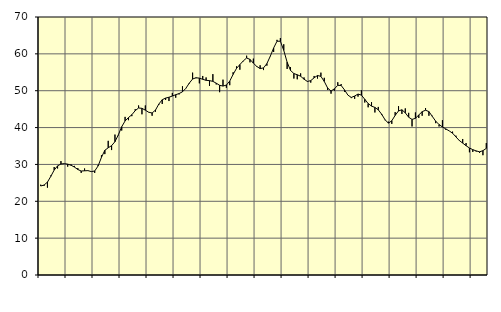
| Category | Piggar | Series 1 |
|---|---|---|
| nan | 24.5 | 24.15 |
| 87.0 | 24.2 | 24.41 |
| 87.0 | 23.7 | 25.2 |
| 87.0 | 27 | 26.77 |
| nan | 29.3 | 28.47 |
| 88.0 | 28.9 | 29.61 |
| 88.0 | 30.9 | 30.12 |
| 88.0 | 30.2 | 30.22 |
| nan | 29.4 | 30.08 |
| 89.0 | 30 | 29.78 |
| 89.0 | 29.6 | 29.28 |
| 89.0 | 29 | 28.62 |
| nan | 27.7 | 28.21 |
| 90.0 | 28.9 | 28.27 |
| 90.0 | 28.3 | 28.32 |
| 90.0 | 28.1 | 28.05 |
| nan | 27.7 | 28.22 |
| 91.0 | 29.8 | 29.57 |
| 91.0 | 32.5 | 31.93 |
| 91.0 | 32.8 | 33.83 |
| nan | 36.4 | 34.52 |
| 92.0 | 33.9 | 35.09 |
| 92.0 | 38.1 | 36.17 |
| 92.0 | 37.9 | 38.03 |
| nan | 39.2 | 40.23 |
| 93.0 | 42.9 | 41.79 |
| 93.0 | 42 | 42.71 |
| 93.0 | 43.1 | 43.48 |
| nan | 45 | 44.59 |
| 94.0 | 46 | 45.31 |
| 94.0 | 43.6 | 45.22 |
| 94.0 | 46 | 44.72 |
| nan | 44.2 | 44.16 |
| 95.0 | 43.2 | 43.96 |
| 95.0 | 44.3 | 44.74 |
| 95.0 | 46.2 | 46.39 |
| nan | 46.4 | 47.55 |
| 96.0 | 47.5 | 48 |
| 96.0 | 47.2 | 48.23 |
| 96.0 | 49.4 | 48.56 |
| nan | 48.1 | 48.92 |
| 97.0 | 49 | 49.23 |
| 97.0 | 51.2 | 49.7 |
| 97.0 | 50.6 | 50.64 |
| nan | 51.9 | 52.04 |
| 98.0 | 54.9 | 53.17 |
| 98.0 | 53.4 | 53.52 |
| 98.0 | 52 | 53.41 |
| nan | 54 | 53.09 |
| 99.0 | 53.6 | 52.82 |
| 99.0 | 51.3 | 52.73 |
| 99.0 | 54.5 | 52.54 |
| nan | 51.7 | 52.04 |
| 0.0 | 49.6 | 51.47 |
| 0.0 | 53 | 51.26 |
| 0.0 | 50.8 | 51.53 |
| nan | 51.5 | 52.61 |
| 1.0 | 55 | 54.43 |
| 1.0 | 56.6 | 56.04 |
| 1.0 | 55.7 | 57.09 |
| nan | 58 | 58.08 |
| 2.0 | 59.5 | 58.87 |
| 2.0 | 57.7 | 58.5 |
| 2.0 | 58.7 | 57.47 |
| nan | 56.7 | 56.59 |
| 3.0 | 56.9 | 56 |
| 3.0 | 55.6 | 56.19 |
| 3.0 | 56.8 | 57.35 |
| nan | 59.4 | 59.34 |
| 4.0 | 60.5 | 61.59 |
| 4.0 | 63.8 | 63.43 |
| 4.0 | 64.3 | 63.42 |
| nan | 62.6 | 60.95 |
| 5.0 | 55.9 | 57.74 |
| 5.0 | 56.4 | 55.51 |
| 5.0 | 53.3 | 54.66 |
| nan | 53.1 | 54.33 |
| 6.0 | 54.7 | 53.93 |
| 6.0 | 53.6 | 53.13 |
| 6.0 | 52.6 | 52.51 |
| nan | 52.2 | 52.74 |
| 7.0 | 54 | 53.5 |
| 7.0 | 53.3 | 54.13 |
| 7.0 | 54.9 | 53.89 |
| nan | 53.5 | 52.51 |
| 8.0 | 50.2 | 50.72 |
| 8.0 | 49.2 | 49.91 |
| 8.0 | 50 | 50.51 |
| nan | 52.3 | 51.46 |
| 9.0 | 51.8 | 51.42 |
| 9.0 | 49.7 | 50.22 |
| 9.0 | 48.8 | 48.81 |
| nan | 48 | 48.17 |
| 10.0 | 47.8 | 48.56 |
| 10.0 | 48.4 | 49.1 |
| 10.0 | 50.1 | 48.8 |
| nan | 46.8 | 47.68 |
| 11.0 | 45.5 | 46.52 |
| 11.0 | 46.9 | 45.83 |
| 11.0 | 44.1 | 45.47 |
| nan | 45.6 | 44.81 |
| 12.0 | 43.4 | 43.62 |
| 12.0 | 42 | 42.13 |
| 12.0 | 41.6 | 41.2 |
| nan | 41 | 41.84 |
| 13.0 | 44.2 | 43.31 |
| 13.0 | 45.8 | 44.52 |
| 13.0 | 43.7 | 44.83 |
| nan | 45.2 | 44 |
| 14.0 | 44 | 42.81 |
| 14.0 | 40.3 | 42.21 |
| 14.0 | 44.1 | 42.51 |
| nan | 42.6 | 43.42 |
| 15.0 | 43.2 | 44.31 |
| 15.0 | 45.3 | 44.71 |
| 15.0 | 43.2 | 44.34 |
| nan | 43.2 | 43.03 |
| 16.0 | 41.2 | 41.74 |
| 16.0 | 40.3 | 40.82 |
| 16.0 | 42 | 40.16 |
| nan | 39.4 | 39.64 |
| 17.0 | 39.1 | 39.1 |
| 17.0 | 38.9 | 38.48 |
| 17.0 | 37.8 | 37.46 |
| nan | 36.4 | 36.49 |
| 18.0 | 36.9 | 35.79 |
| 18.0 | 35.8 | 35.08 |
| 18.0 | 33.3 | 34.46 |
| nan | 33.4 | 34.01 |
| 19.0 | 33.5 | 33.67 |
| 19.0 | 33.1 | 33.42 |
| 19.0 | 32.5 | 33.73 |
| nan | 35.8 | 34.36 |